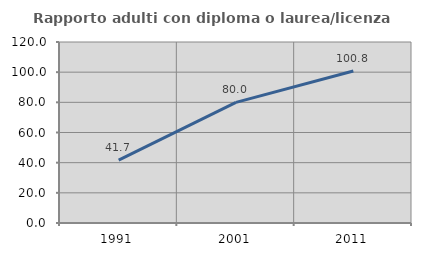
| Category | Rapporto adulti con diploma o laurea/licenza media  |
|---|---|
| 1991.0 | 41.748 |
| 2001.0 | 79.978 |
| 2011.0 | 100.759 |